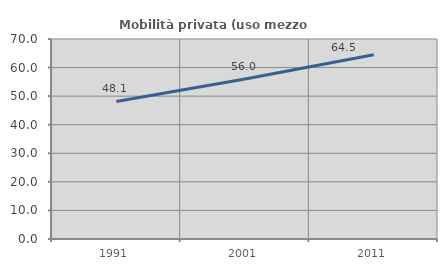
| Category | Mobilità privata (uso mezzo privato) |
|---|---|
| 1991.0 | 48.126 |
| 2001.0 | 55.984 |
| 2011.0 | 64.507 |